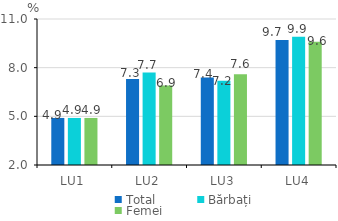
| Category | Total | Bărbați | Femei |
|---|---|---|---|
| LU1 | 4.9 | 4.9 | 4.9 |
| LU2 | 7.3 | 7.7 | 6.9 |
| LU3 | 7.4 | 7.2 | 7.6 |
| LU4 | 9.7 | 9.9 | 9.6 |